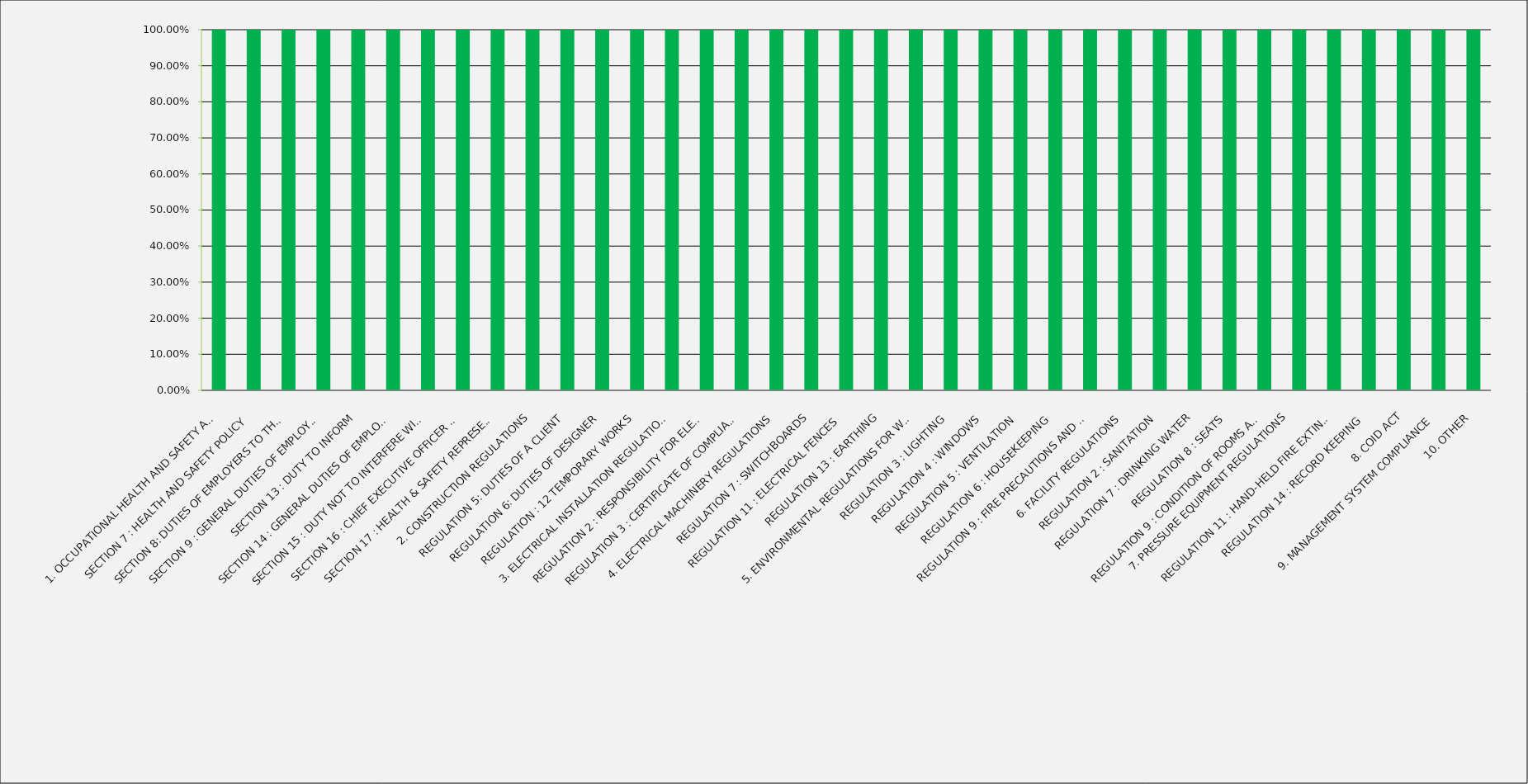
| Category | Compliant | Non Compliant |
|---|---|---|
| 1. OCCUPATIONAL HEALTH AND SAFETY ACT | 1 | 0 |
| SECTION 7 : HEALTH AND SAFETY POLICY | 1 | 0 |
| SECTION 8: DUTIES OF EMPLOYERS TO THEIR EMPLOYEES | 1 | 0 |
| SECTION 9 : GENERAL DUTIES OF EMPLOYERS – OTHER PERSONS | 1 | 0 |
| SECTION 13 : DUTY TO INFORM | 1 | 0 |
| SECTION 14 : GENERAL DUTIES OF EMPLOYEES | 1 | 0 |
| SECTION 15 : DUTY NOT TO INTERFERE WITH, DAMAGE OR MISUSE THINGS | 1 | 0 |
| SECTION 16 : CHIEF EXECUTIVE OFFICER CHARGED WITH CERTAIN DUTIES | 1 | 0 |
| SECTION 17 : HEALTH & SAFETY REPRESENTATIVES | 1 | 0 |
| 2. CONSTRUCTION REGULATIONS | 1 | 0 |
| REGULATION 5: DUTIES OF A CLIENT | 1 | 0 |
| REGULATION 6: DUTIES OF DESIGNER | 1 | 0 |
| REGULATION : 12 TEMPORARY WORKS | 1 | 0 |
| 3. ELECTRICAL INSTALLATION REGULATIONS | 1 | 0 |
| REGULATION 2 : RESPONSIBILITY FOR ELECTRICAL INSTALLATION | 1 | 0 |
| REGULATION 3 : CERTIFICATE OF COMPLIANCE | 1 | 0 |
| 4. ELECTRICAL MACHINERY REGULATIONS | 1 | 0 |
| REGULATION 7 : SWITCHBOARDS | 1 | 0 |
| REGULATION 11 : ELECTRICAL FENCES | 1 | 0 |
| REGULATION 13 : EARTHING | 1 | 0 |
| 5. ENVIRONMENTAL REGULATIONS FOR WORKPLACES | 1 | 0 |
| REGULATION 3 : LIGHTING | 1 | 0 |
| REGULATION 4 : WINDOWS | 1 | 0 |
| REGULATION 5 : VENTILATION | 1 | 0 |
| REGULATION 6 : HOUSEKEEPING | 1 | 0 |
| REGULATION 9 : FIRE PRECAUTIONS AND MEANS OF EGRESS | 1 | 0 |
| 6. FACILITY REGULATIONS | 1 | 0 |
| REGULATION 2 : SANITATION | 1 | 0 |
| REGULATION 7 : DRINKING WATER | 1 | 0 |
| REGULATION 8 : SEATS | 1 | 0 |
| REGULATION 9 : CONDITION OF ROOMS AND FACILITIES | 1 | 0 |
| 7. PRESSURE EQUIPMENT REGULATIONS
 | 1 | 0 |
| REGULATION 11 : HAND-HELD FIRE EXTINGUISHERS | 1 | 0 |
| REGULATION 14 : RECORD KEEPING | 1 | 0 |
| 8. COID ACT | 1 | 0 |
| 9. MANAGEMENT SYSTEM COMPLIANCE | 1 | 0 |
| 10. OTHER | 1 | 0 |